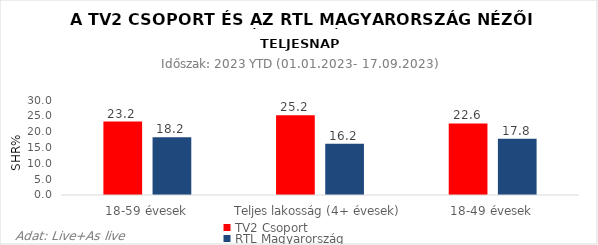
| Category | TV2 Csoport | RTL Magyarország |
|---|---|---|
| 18-59 évesek | 23.2 | 18.2 |
| Teljes lakosság (4+ évesek) | 25.2 | 16.2 |
| 18-49 évesek | 22.6 | 17.8 |